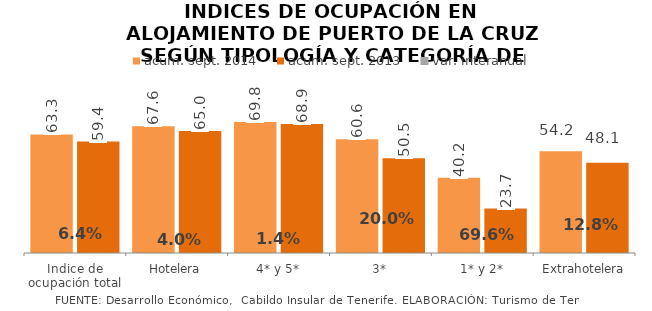
| Category | acum. sept. 2014 | acum. sept. 2013 |
|---|---|---|
| Indice de ocupación total | 63.254 | 59.424 |
| Hotelera | 67.637 | 65.034 |
| 4* y 5* | 69.82 | 68.865 |
| 3* | 60.633 | 50.524 |
| 1* y 2* | 40.179 | 23.696 |
| Extrahotelera | 54.244 | 48.081 |